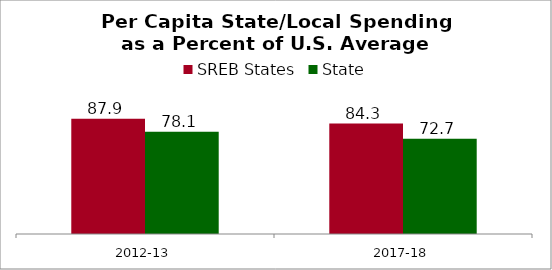
| Category | SREB States | State |
|---|---|---|
| 2012-13 | 87.948 | 78.141 |
| 2017-18 | 84.321 | 72.747 |